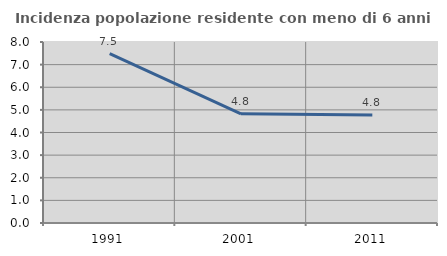
| Category | Incidenza popolazione residente con meno di 6 anni |
|---|---|
| 1991.0 | 7.488 |
| 2001.0 | 4.824 |
| 2011.0 | 4.773 |